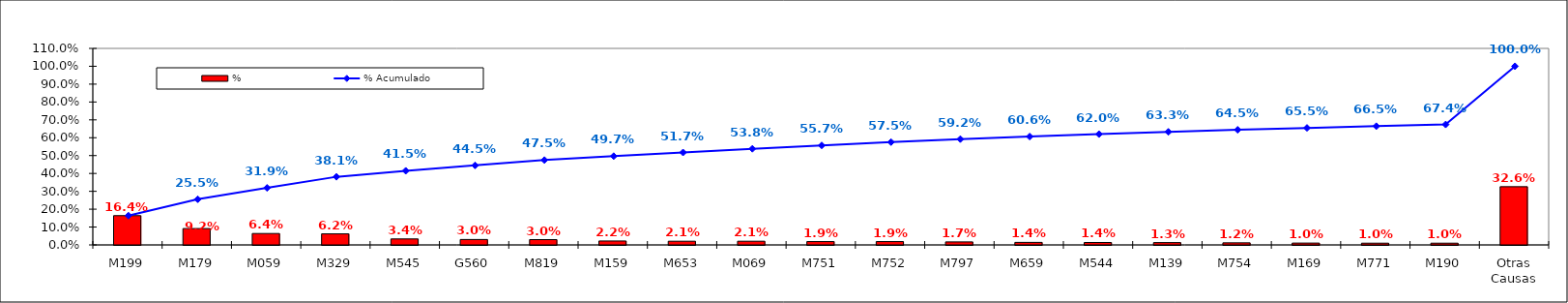
| Category | % |
|---|---|
| M199 | 0.164 |
| M179 | 0.092 |
| M059 | 0.064 |
| M329 | 0.062 |
| M545 | 0.034 |
| G560 | 0.03 |
| M819 | 0.03 |
| M159 | 0.022 |
| M653 | 0.021 |
| M069 | 0.021 |
| M751 | 0.019 |
| M752 | 0.019 |
| M797 | 0.017 |
| M659 | 0.014 |
| M544 | 0.014 |
| M139 | 0.013 |
| M754 | 0.012 |
| M169 | 0.01 |
| M771 | 0.01 |
| M190 | 0.01 |
| Otras Causas | 0.326 |